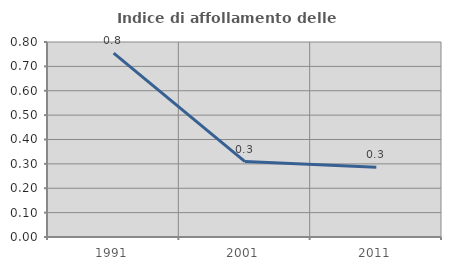
| Category | Indice di affollamento delle abitazioni  |
|---|---|
| 1991.0 | 0.754 |
| 2001.0 | 0.31 |
| 2011.0 | 0.286 |